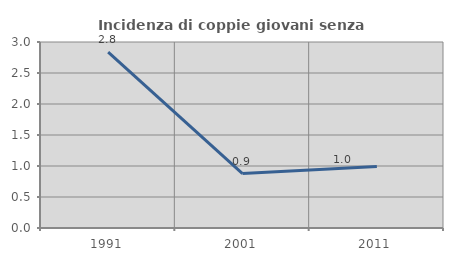
| Category | Incidenza di coppie giovani senza figli |
|---|---|
| 1991.0 | 2.837 |
| 2001.0 | 0.877 |
| 2011.0 | 0.99 |